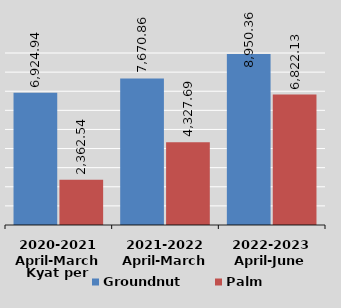
| Category | Groundnut | Palm |
|---|---|---|
| 2020-2021
April-March
 | 6924.942 | 2362.542 |
| 2021-2022
April-March
 | 7670.863 | 4327.695 |
| 2022-2023
April-June

 | 8950.356 | 6822.131 |